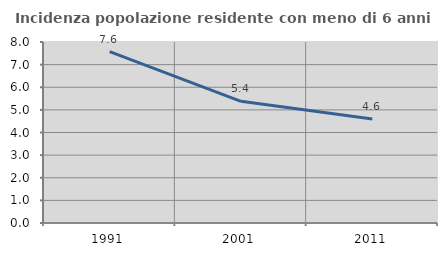
| Category | Incidenza popolazione residente con meno di 6 anni |
|---|---|
| 1991.0 | 7.574 |
| 2001.0 | 5.376 |
| 2011.0 | 4.598 |